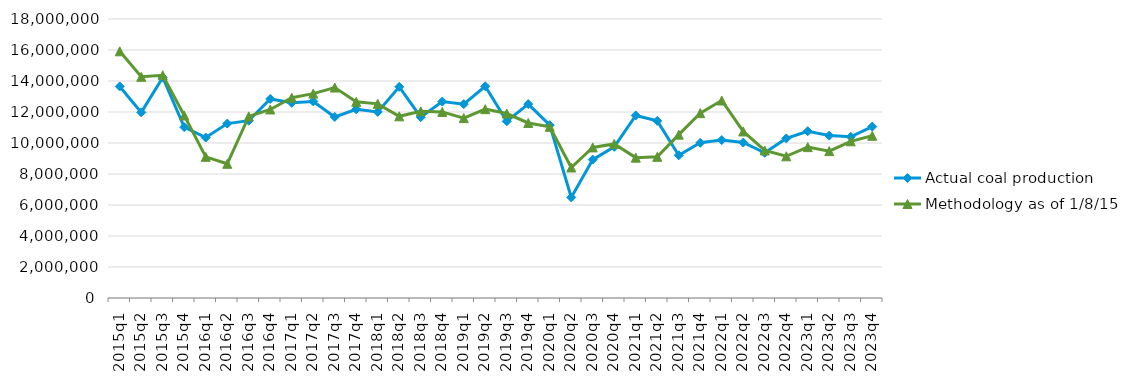
| Category | Actual coal production | Methodology as of 1/8/15 |
|---|---|---|
| 2015q1 | 13647093 | 15916839 |
| 2015q2 | 11975525 | 14270319 |
| 2015q3 | 14224433 | 14373441 |
| 2015q4 | 11024681 | 11777174 |
| 2016q1 | 10350910 | 9106027 |
| 2016q2 | 11253314 | 8658419 |
| 2016q3 | 11439220 | 11715209 |
| 2016q4 | 12841782 | 12164490 |
| 2017q1 | 12593950 | 12918525 |
| 2017q2 | 12682325 | 13186561 |
| 2017q3 | 11678323 | 13579366 |
| 2017q4 | 12176728 | 12657816 |
| 2018q1 | 12003418 | 12526512 |
| 2018q2 | 13625005 | 11721425 |
| 2018q3 | 11668000 | 12041217 |
| 2018q4 | 12671632 | 12005492 |
| 2019q1 | 12508476 | 11605338 |
| 2019q2 | 13660577 | 12184128 |
| 2019q3 | 11399930 | 11902532 |
| 2019q4 | 12509149 | 11293155 |
| 2020q1 | 11151366 | 11044139 |
| 2020q2 | 6488660 | 8420740 |
| 2020q3 | 8929921 | 9715815 |
| 2020q4 | 9755970 | 9941448 |
| 2021q1 | 11777094 | 9056278 |
| 2021q2 | 11426275 | 9105908 |
| 2021q3 | 9206043 | 10539818 |
| 2021q4 | 10012660 | 11927487 |
| 2022q1 | 10188703 | 12742892 |
| 2022q2 | 10031196 | 10745671 |
| 2022q3 | 9367548 | 9520654 |
| 2022q4 | 10294803 | 9142551 |
| 2023q1 | 10759395 | 9734758 |
| 2023q2 | 10479701 | 9476610 |
| 2023q3 | 10398265 | 10107968 |
| 2023q4 | 11060299 | 10465867 |